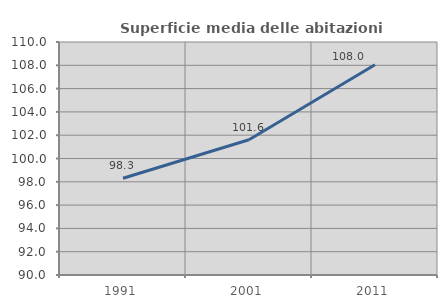
| Category | Superficie media delle abitazioni occupate |
|---|---|
| 1991.0 | 98.301 |
| 2001.0 | 101.614 |
| 2011.0 | 108.044 |